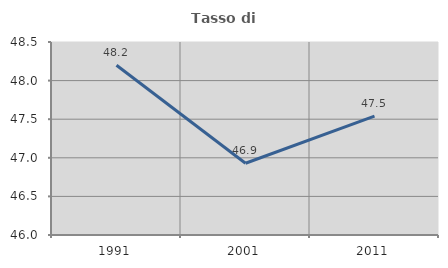
| Category | Tasso di occupazione   |
|---|---|
| 1991.0 | 48.198 |
| 2001.0 | 46.93 |
| 2011.0 | 47.541 |